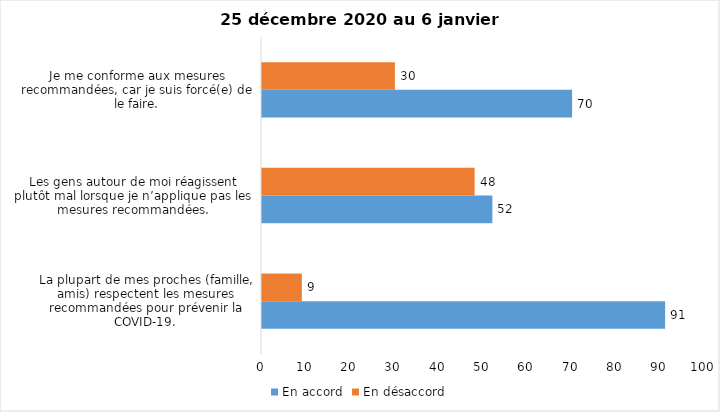
| Category | En accord | En désaccord |
|---|---|---|
| La plupart de mes proches (famille, amis) respectent les mesures recommandées pour prévenir la COVID-19. | 91 | 9 |
| Les gens autour de moi réagissent plutôt mal lorsque je n’applique pas les mesures recommandées. | 52 | 48 |
| Je me conforme aux mesures recommandées, car je suis forcé(e) de le faire. | 70 | 30 |